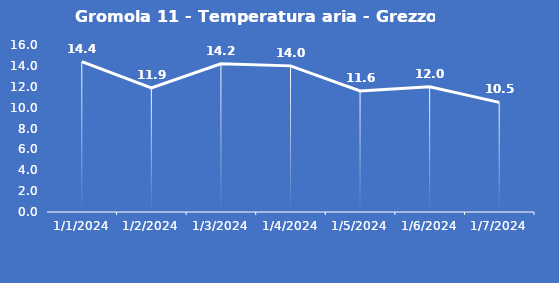
| Category | Gromola 11 - Temperatura aria - Grezzo (°C) |
|---|---|
| 1/1/24 | 14.4 |
| 1/2/24 | 11.9 |
| 1/3/24 | 14.2 |
| 1/4/24 | 14 |
| 1/5/24 | 11.6 |
| 1/6/24 | 12 |
| 1/7/24 | 10.5 |